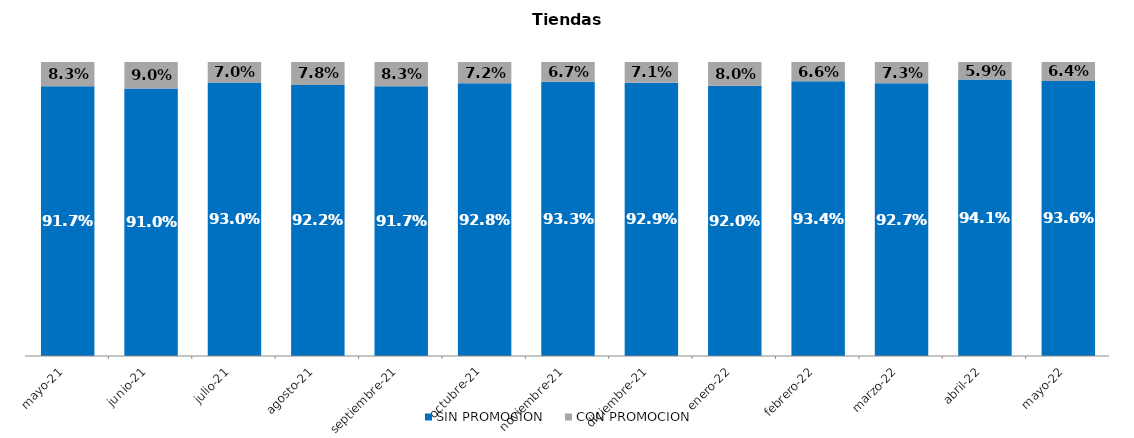
| Category | SIN PROMOCION   | CON PROMOCION   |
|---|---|---|
| 2021-05-01 | 0.917 | 0.083 |
| 2021-06-01 | 0.91 | 0.09 |
| 2021-07-01 | 0.93 | 0.07 |
| 2021-08-01 | 0.922 | 0.078 |
| 2021-09-01 | 0.917 | 0.083 |
| 2021-10-01 | 0.928 | 0.072 |
| 2021-11-01 | 0.933 | 0.067 |
| 2021-12-01 | 0.929 | 0.071 |
| 2022-01-01 | 0.92 | 0.08 |
| 2022-02-01 | 0.934 | 0.066 |
| 2022-03-01 | 0.927 | 0.073 |
| 2022-04-01 | 0.941 | 0.059 |
| 2022-05-01 | 0.936 | 0.064 |